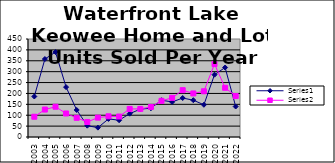
| Category | Series 0 | Series 1 |
|---|---|---|
| 2003.0 | 186 | 93 |
| 2004.0 | 358 | 126 |
| 2005.0 | 390 | 139 |
| 2006.0 | 229 | 108 |
| 2007.0 | 124 | 88 |
| 2008.0 | 52 | 69 |
| 2009.0 | 43 | 89 |
| 2010.0 | 83 | 95 |
| 2011.0 | 77 | 94 |
| 2012.0 | 107 | 129 |
| 2013.0 | 128 | 129 |
| 2014.0 | 132 | 138 |
| 2015.0 | 169 | 166 |
| 2016.0 | 161 | 180 |
| 2017.0 | 179 | 215 |
| 2018.0 | 169 | 200 |
| 2019.0 | 148 | 210 |
| 2020.0 | 286 | 335 |
| 2021.0 | 319 | 226 |
| 2022.0 | 140 | 188 |